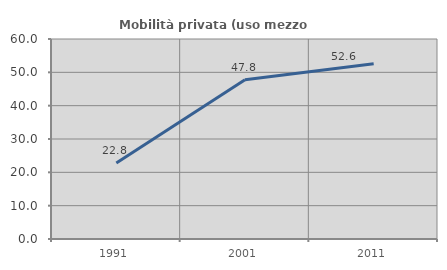
| Category | Mobilità privata (uso mezzo privato) |
|---|---|
| 1991.0 | 22.814 |
| 2001.0 | 47.765 |
| 2011.0 | 52.566 |